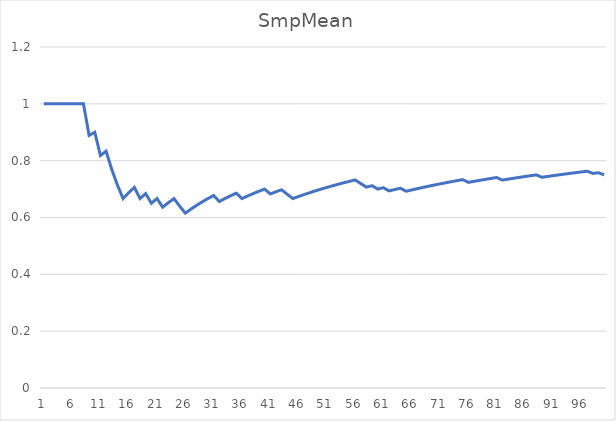
| Category | SmpMean |
|---|---|
| 0 | 1 |
| 1 | 1 |
| 2 | 1 |
| 3 | 1 |
| 4 | 1 |
| 5 | 1 |
| 6 | 1 |
| 7 | 1 |
| 8 | 0.889 |
| 9 | 0.9 |
| 10 | 0.818 |
| 11 | 0.833 |
| 12 | 0.769 |
| 13 | 0.714 |
| 14 | 0.667 |
| 15 | 0.688 |
| 16 | 0.706 |
| 17 | 0.667 |
| 18 | 0.684 |
| 19 | 0.65 |
| 20 | 0.667 |
| 21 | 0.636 |
| 22 | 0.652 |
| 23 | 0.667 |
| 24 | 0.64 |
| 25 | 0.615 |
| 26 | 0.63 |
| 27 | 0.643 |
| 28 | 0.655 |
| 29 | 0.667 |
| 30 | 0.677 |
| 31 | 0.656 |
| 32 | 0.667 |
| 33 | 0.676 |
| 34 | 0.686 |
| 35 | 0.667 |
| 36 | 0.676 |
| 37 | 0.684 |
| 38 | 0.692 |
| 39 | 0.7 |
| 40 | 0.683 |
| 41 | 0.69 |
| 42 | 0.698 |
| 43 | 0.682 |
| 44 | 0.667 |
| 45 | 0.674 |
| 46 | 0.681 |
| 47 | 0.688 |
| 48 | 0.694 |
| 49 | 0.7 |
| 50 | 0.706 |
| 51 | 0.712 |
| 52 | 0.717 |
| 53 | 0.722 |
| 54 | 0.727 |
| 55 | 0.732 |
| 56 | 0.719 |
| 57 | 0.707 |
| 58 | 0.712 |
| 59 | 0.7 |
| 60 | 0.705 |
| 61 | 0.694 |
| 62 | 0.698 |
| 63 | 0.703 |
| 64 | 0.692 |
| 65 | 0.697 |
| 66 | 0.701 |
| 67 | 0.706 |
| 68 | 0.71 |
| 69 | 0.714 |
| 70 | 0.718 |
| 71 | 0.722 |
| 72 | 0.726 |
| 73 | 0.73 |
| 74 | 0.733 |
| 75 | 0.724 |
| 76 | 0.727 |
| 77 | 0.731 |
| 78 | 0.734 |
| 79 | 0.738 |
| 80 | 0.741 |
| 81 | 0.732 |
| 82 | 0.735 |
| 83 | 0.738 |
| 84 | 0.741 |
| 85 | 0.744 |
| 86 | 0.747 |
| 87 | 0.75 |
| 88 | 0.742 |
| 89 | 0.744 |
| 90 | 0.747 |
| 91 | 0.75 |
| 92 | 0.753 |
| 93 | 0.755 |
| 94 | 0.758 |
| 95 | 0.76 |
| 96 | 0.763 |
| 97 | 0.755 |
| 98 | 0.758 |
| 99 | 0.75 |